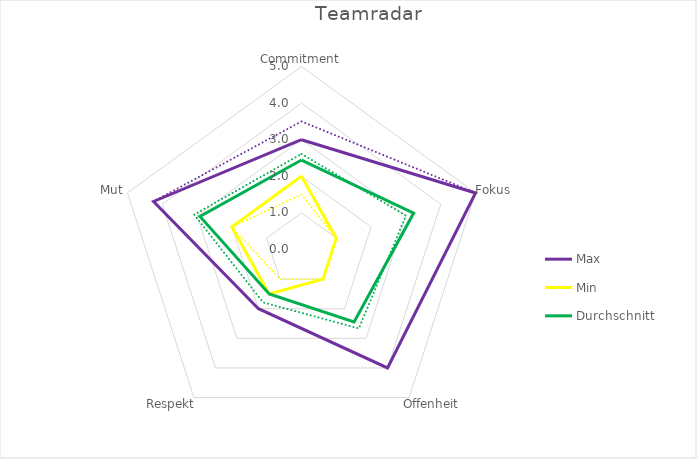
| Category | Durchschnitt | Max | Min |
|---|---|---|---|
| Commitment | 2.444 | 3.5 | 1.5 |
| Fokus | 3.222 | 5 | 1 |
| Offenheit | 2.444 | 4 | 1 |
| Respekt | 1.5 | 2 | 1 |
| Mut | 2.917 | 4.25 | 2 |